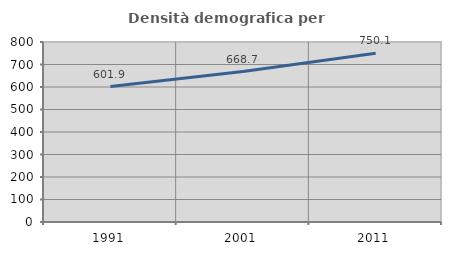
| Category | Densità demografica |
|---|---|
| 1991.0 | 601.933 |
| 2001.0 | 668.669 |
| 2011.0 | 750.1 |